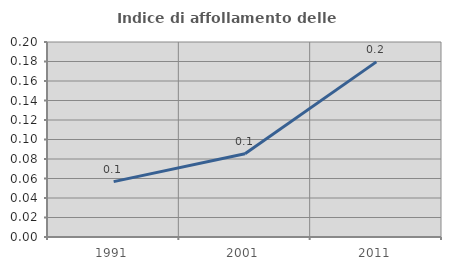
| Category | Indice di affollamento delle abitazioni  |
|---|---|
| 1991.0 | 0.057 |
| 2001.0 | 0.085 |
| 2011.0 | 0.18 |